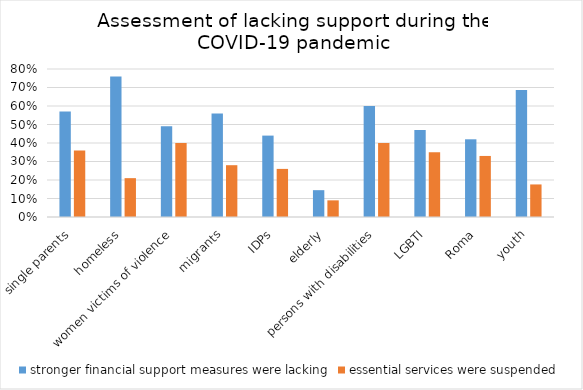
| Category | stronger financial support measures were lacking | essential services were suspended |
|---|---|---|
| single parents | 0.57 | 0.36 |
| homeless | 0.76 | 0.21 |
| women victims of violence | 0.49 | 0.4 |
| migrants | 0.56 | 0.28 |
| IDPs | 0.44 | 0.26 |
| elderly | 0.145 | 0.09 |
| persons with disabilities | 0.6 | 0.4 |
| LGBTI | 0.47 | 0.35 |
| Roma | 0.42 | 0.33 |
| youth | 0.687 | 0.176 |